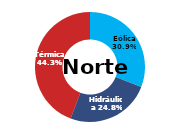
| Category | Norte |
|---|---|
| Eólica | 110.403 |
| Hidráulica | 88.79 |
| Solar | 0 |
| Térmica | 158.223 |